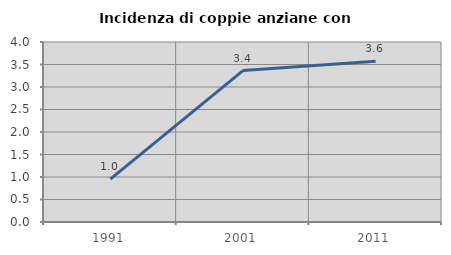
| Category | Incidenza di coppie anziane con figli |
|---|---|
| 1991.0 | 0.952 |
| 2001.0 | 3.365 |
| 2011.0 | 3.571 |